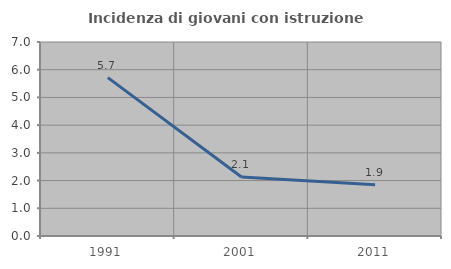
| Category | Incidenza di giovani con istruzione universitaria |
|---|---|
| 1991.0 | 5.714 |
| 2001.0 | 2.128 |
| 2011.0 | 1.852 |